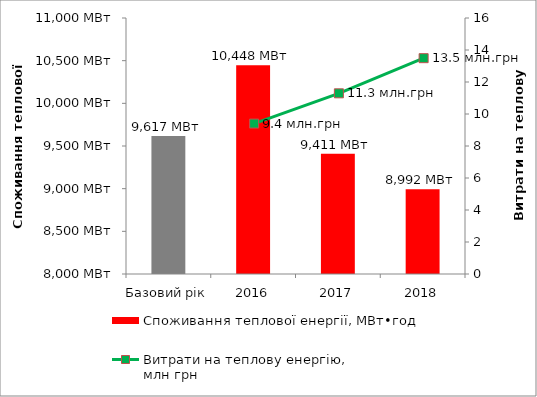
| Category | Споживання теплової енергії, МВт•год |
|---|---|
| Базовий рік | 9616.935 |
| 2016 | 10447.725 |
| 2017 | 9410.643 |
| 2018 | 8992.438 |